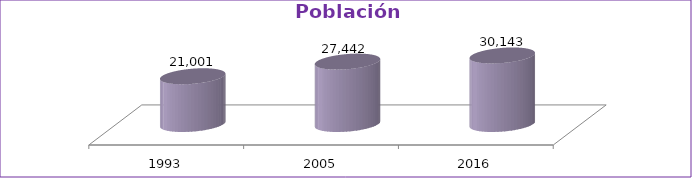
| Category | Población Total |
|---|---|
| 1993 | 21001 |
| 2005 | 27442 |
| 2016 | 30143 |